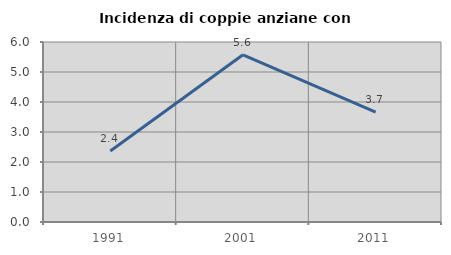
| Category | Incidenza di coppie anziane con figli |
|---|---|
| 1991.0 | 2.367 |
| 2001.0 | 5.574 |
| 2011.0 | 3.663 |